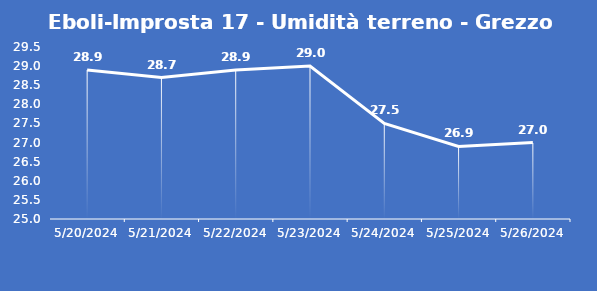
| Category | Eboli-Improsta 17 - Umidità terreno - Grezzo (%VWC) |
|---|---|
| 5/20/24 | 28.9 |
| 5/21/24 | 28.7 |
| 5/22/24 | 28.9 |
| 5/23/24 | 29 |
| 5/24/24 | 27.5 |
| 5/25/24 | 26.9 |
| 5/26/24 | 27 |